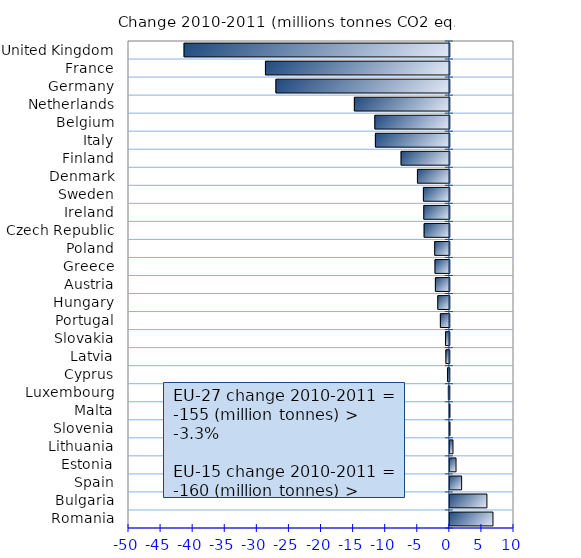
| Category | Change 2010–2011 (million tonnes) |
|---|---|
| Romania | 6.724 |
| Bulgaria | 5.781 |
| Spain | 1.842 |
| Estonia | 0.967 |
| Lithuania | 0.491 |
| Slovenia | 0.028 |
| Malta | 0.023 |
| Luxembourg | -0.154 |
| Cyprus | -0.289 |
| Latvia | -0.54 |
| Slovakia | -0.599 |
| Portugal | -1.396 |
| Hungary | -1.798 |
| Austria | -2.171 |
| Greece | -2.233 |
| Poland | -2.281 |
| Czech Republic | -3.927 |
| Ireland | -3.98 |
| Sweden | -4.038 |
| Denmark | -4.969 |
| Finland | -7.518 |
| Italy | -11.522 |
| Belgium | -11.611 |
| Netherlands | -14.798 |
| Germany | -27.023 |
| France | -28.657 |
| United Kingdom | -41.339 |